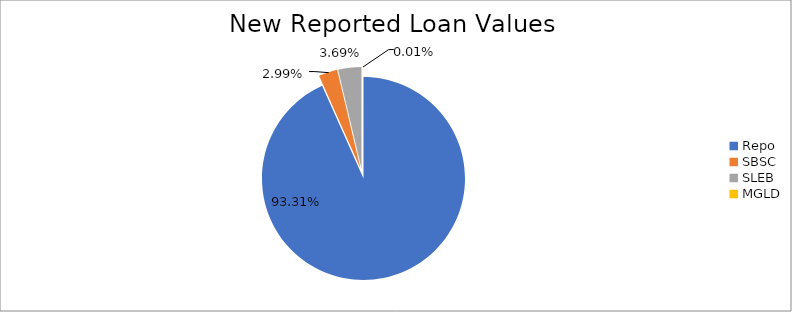
| Category | Series 0 |
|---|---|
| Repo | 8490613.584 |
| SBSC | 271985.446 |
| SLEB | 335551.56 |
| MGLD | 1055.257 |